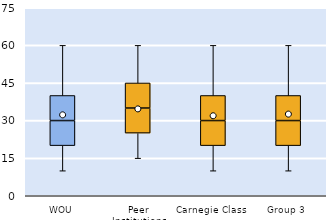
| Category | 25th | 50th | 75th |
|---|---|---|---|
| WOU | 20 | 10 | 10 |
| Peer Institutions | 25 | 10 | 10 |
| Carnegie Class | 20 | 10 | 10 |
| Group 3 | 20 | 10 | 10 |